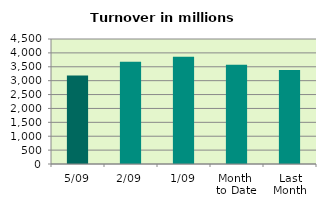
| Category | Series 0 |
|---|---|
| 5/09 | 3185.574 |
| 2/09 | 3683.304 |
| 1/09 | 3861.356 |
| Month 
to Date | 3576.745 |
| Last
Month | 3384.596 |